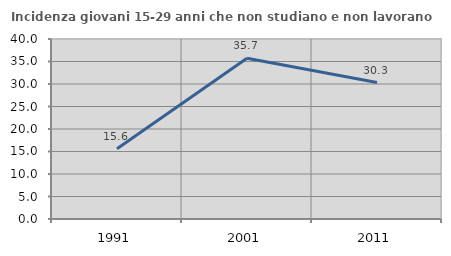
| Category | Incidenza giovani 15-29 anni che non studiano e non lavorano  |
|---|---|
| 1991.0 | 15.609 |
| 2001.0 | 35.725 |
| 2011.0 | 30.331 |